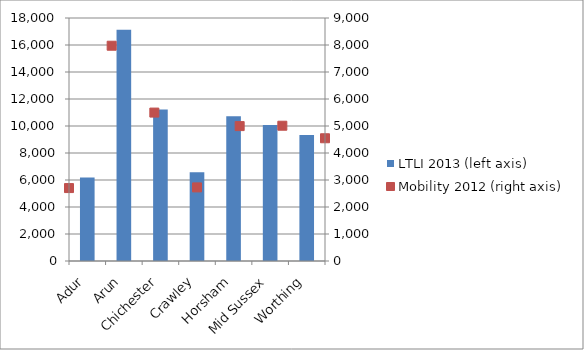
| Category | LTLI 2013 (left axis) |
|---|---|
| Adur  | 6186 |
| Arun | 17128 |
| Chichester | 11221 |
| Crawley | 6571 |
| Horsham | 10713 |
| Mid Sussex | 10070 |
| Worthing | 9329 |